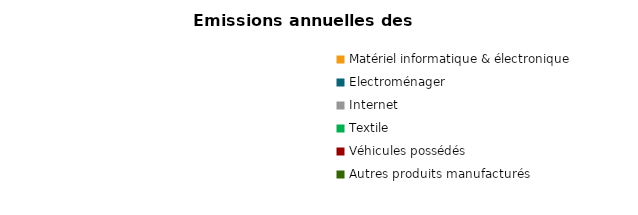
| Category | kg eq CO2 |
|---|---|
| Matériel informatique & électronique  | 0 |
| Electroménager | 0 |
| Internet | 0 |
| Textile | 0 |
| Véhicules possédés | 0 |
| Autres produits manufacturés  | 0 |